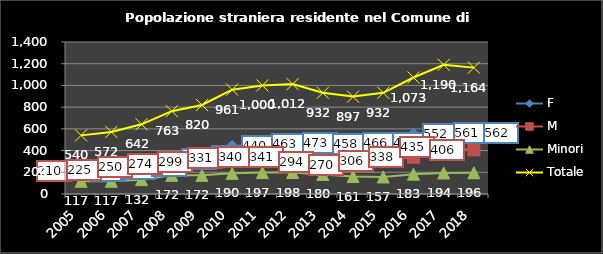
| Category | F | M | Minori | Totale |
|---|---|---|---|---|
| 2005.0 | 213 | 210 | 117 | 540 |
| 2006.0 | 230 | 225 | 117 | 572 |
| 2007.0 | 260 | 250 | 132 | 642 |
| 2008.0 | 318 | 274 | 172 | 763 |
| 2009.0 | 349 | 299 | 172 | 820 |
| 2010.0 | 440 | 331 | 190 | 961 |
| 2011.0 | 463 | 340 | 197 | 1000 |
| 2012.0 | 473 | 341 | 198 | 1012 |
| 2013.0 | 458 | 294 | 180 | 932 |
| 2014.0 | 466 | 270 | 161 | 897 |
| 2015.0 | 469 | 306 | 157 | 932 |
| 2016.0 | 552 | 338 | 183 | 1073 |
| 2017.0 | 561 | 435 | 194 | 1190 |
| 2018.0 | 562 | 406 | 196 | 1164 |